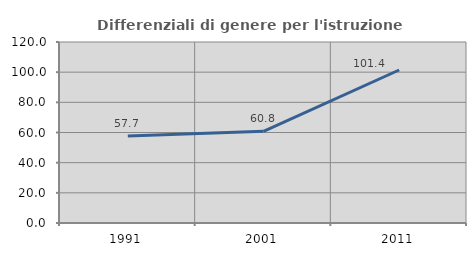
| Category | Differenziali di genere per l'istruzione superiore |
|---|---|
| 1991.0 | 57.692 |
| 2001.0 | 60.768 |
| 2011.0 | 101.433 |